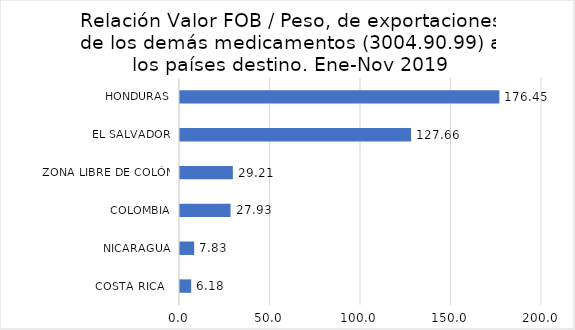
| Category | Series 0 |
|---|---|
| COSTA RICA   | 6.175 |
| NICARAGUA | 7.828 |
| COLOMBIA | 27.928 |
| ZONA LIBRE DE COLÓN | 29.207 |
| EL SALVADOR | 127.66 |
| HONDURAS | 176.451 |